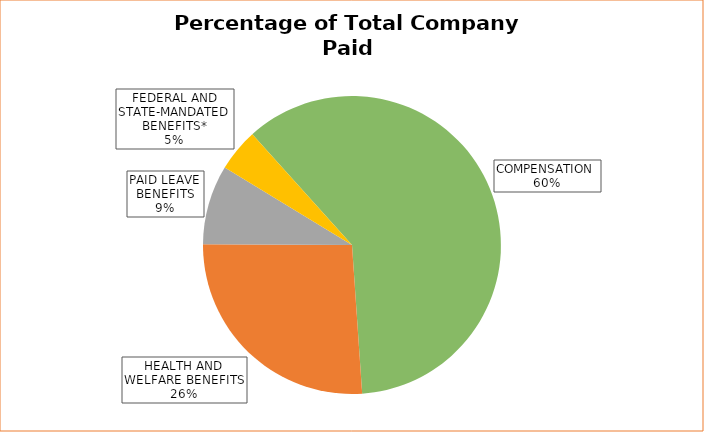
| Category | Series 0 |
|---|---|
| COMPENSATION  | 50000 |
| HEALTH AND WELFARE BENEFITS | 21596.2 |
| PAID LEAVE BENEFITS | 7115.385 |
| FEDERAL AND STATE-MANDATED BENEFITS* | 3825 |